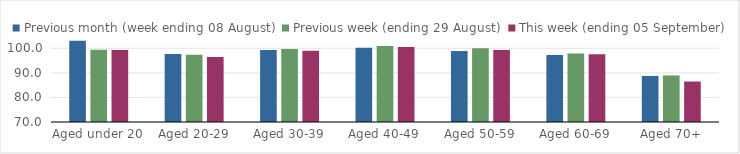
| Category | Previous month (week ending 08 August) | Previous week (ending 29 August) | This week (ending 05 September) |
|---|---|---|---|
| Aged under 20 | 103.03 | 99.42 | 99.31 |
| Aged 20-29 | 97.66 | 97.35 | 96.43 |
| Aged 30-39 | 99.27 | 99.72 | 98.96 |
| Aged 40-49 | 100.19 | 100.91 | 100.54 |
| Aged 50-59 | 98.9 | 100.03 | 99.32 |
| Aged 60-69 | 97.28 | 97.85 | 97.55 |
| Aged 70+ | 88.74 | 88.96 | 86.48 |